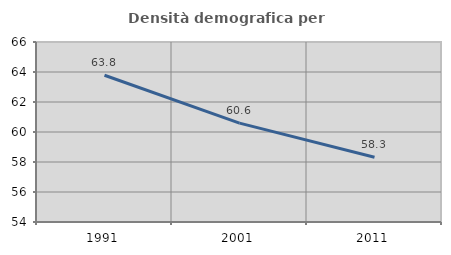
| Category | Densità demografica |
|---|---|
| 1991.0 | 63.783 |
| 2001.0 | 60.589 |
| 2011.0 | 58.32 |